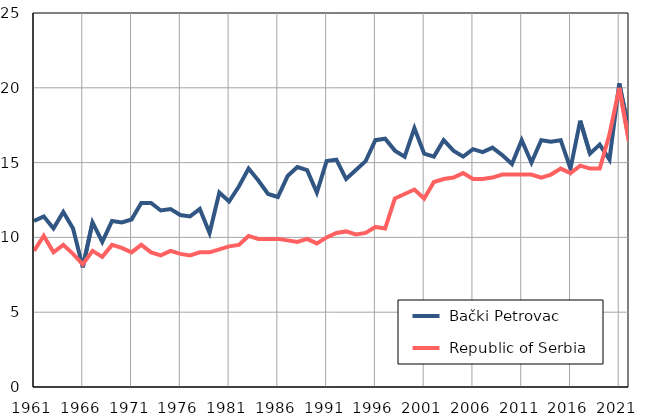
| Category |  Bački Petrovac |  Republic of Serbia |
|---|---|---|
| 1961.0 | 11.1 | 9.1 |
| 1962.0 | 11.4 | 10.1 |
| 1963.0 | 10.6 | 9 |
| 1964.0 | 11.7 | 9.5 |
| 1965.0 | 10.6 | 8.9 |
| 1966.0 | 8 | 8.2 |
| 1967.0 | 11 | 9.1 |
| 1968.0 | 9.7 | 8.7 |
| 1969.0 | 11.1 | 9.5 |
| 1970.0 | 11 | 9.3 |
| 1971.0 | 11.2 | 9 |
| 1972.0 | 12.3 | 9.5 |
| 1973.0 | 12.3 | 9 |
| 1974.0 | 11.8 | 8.8 |
| 1975.0 | 11.9 | 9.1 |
| 1976.0 | 11.5 | 8.9 |
| 1977.0 | 11.4 | 8.8 |
| 1978.0 | 11.9 | 9 |
| 1979.0 | 10.3 | 9 |
| 1980.0 | 13 | 9.2 |
| 1981.0 | 12.4 | 9.4 |
| 1982.0 | 13.4 | 9.5 |
| 1983.0 | 14.6 | 10.1 |
| 1984.0 | 13.8 | 9.9 |
| 1985.0 | 12.9 | 9.9 |
| 1986.0 | 12.7 | 9.9 |
| 1987.0 | 14.1 | 9.8 |
| 1988.0 | 14.7 | 9.7 |
| 1989.0 | 14.5 | 9.9 |
| 1990.0 | 13 | 9.6 |
| 1991.0 | 15.1 | 10 |
| 1992.0 | 15.2 | 10.3 |
| 1993.0 | 13.9 | 10.4 |
| 1994.0 | 14.5 | 10.2 |
| 1995.0 | 15.1 | 10.3 |
| 1996.0 | 16.5 | 10.7 |
| 1997.0 | 16.6 | 10.6 |
| 1998.0 | 15.8 | 12.6 |
| 1999.0 | 15.4 | 12.9 |
| 2000.0 | 17.3 | 13.2 |
| 2001.0 | 15.6 | 12.6 |
| 2002.0 | 15.4 | 13.7 |
| 2003.0 | 16.5 | 13.9 |
| 2004.0 | 15.8 | 14 |
| 2005.0 | 15.4 | 14.3 |
| 2006.0 | 15.9 | 13.9 |
| 2007.0 | 15.7 | 13.9 |
| 2008.0 | 16 | 14 |
| 2009.0 | 15.5 | 14.2 |
| 2010.0 | 14.9 | 14.2 |
| 2011.0 | 16.5 | 14.2 |
| 2012.0 | 15 | 14.2 |
| 2013.0 | 16.5 | 14 |
| 2014.0 | 16.4 | 14.2 |
| 2015.0 | 16.5 | 14.6 |
| 2016.0 | 14.6 | 14.3 |
| 2017.0 | 17.8 | 14.8 |
| 2018.0 | 15.6 | 14.6 |
| 2019.0 | 16.2 | 14.6 |
| 2020.0 | 15.2 | 16.9 |
| 2021.0 | 20.3 | 20 |
| 2022.0 | 17.1 | 16.4 |